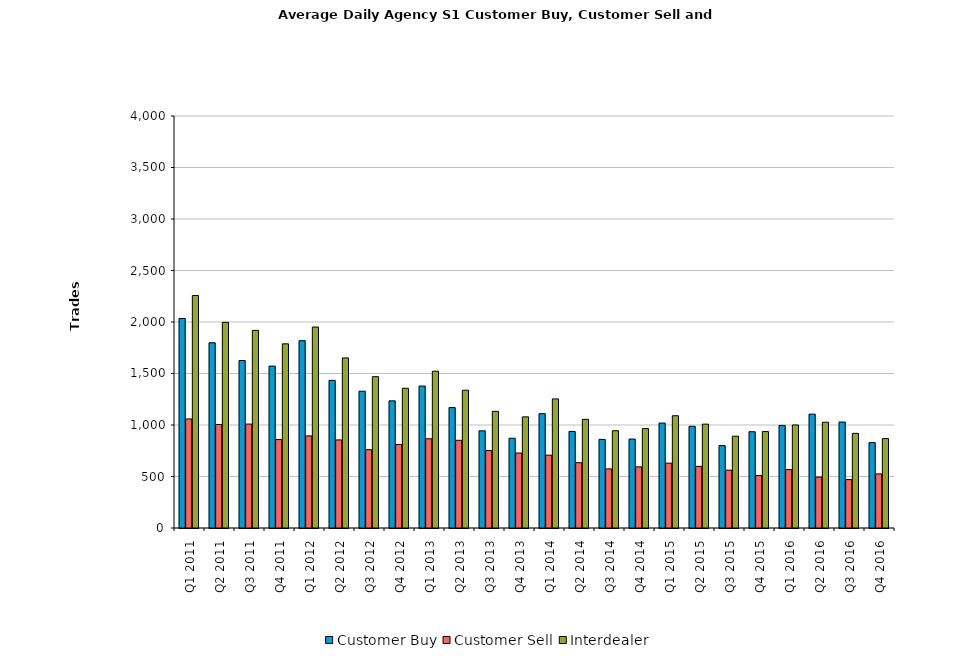
| Category | Customer Buy | Customer Sell | Interdealer |
|---|---|---|---|
| Q1 2011 | 2034.387 | 1058.839 | 2257.29 |
| Q2 2011 | 1798.238 | 1005.46 | 1996.54 |
| Q3 2011 | 1625.875 | 1008.922 | 1918.328 |
| Q4 2011 | 1571.873 | 858.524 | 1788.048 |
| Q1 2012 | 1818.403 | 893.984 | 1950.984 |
| Q2 2012 | 1433.317 | 854.921 | 1651.683 |
| Q3 2012 | 1328.175 | 759.905 | 1468.937 |
| Q4 2012 | 1234.317 | 811.079 | 1356.746 |
| Q1 2013 | 1378.153 | 866.39 | 1522.169 |
| Q2 2013 | 1169.125 | 851.344 | 1337.641 |
| Q3 2013 | 943.422 | 751.781 | 1132.391 |
| Q4 2013 | 871.625 | 728.125 | 1079 |
| Q1 2014 | 1109.705 | 707.328 | 1253.279 |
| Q2 2014 | 937.619 | 633.714 | 1054.984 |
| Q3 2014 | 860.031 | 573.609 | 944.453 |
| Q4 2014 | 863.531 | 593.469 | 965.375 |
| Q1 2015 | 1018.672 | 629.803 | 1089.902 |
| Q2 2015 | 987.222 | 598.317 | 1008.46 |
| Q3 2015 | 800.078 | 561.359 | 891.312 |
| Q4 2015 | 934.656 | 509 | 936.266 |
| Q1 2016 | 995.656 | 566.607 | 1000.246 |
| Q2 2016 | 1105.578 | 494.969 | 1026.594 |
| Q3 2016 | 1028.922 | 469.828 | 918.625 |
| Q4 2016 | 828.651 | 525.016 | 868.317 |